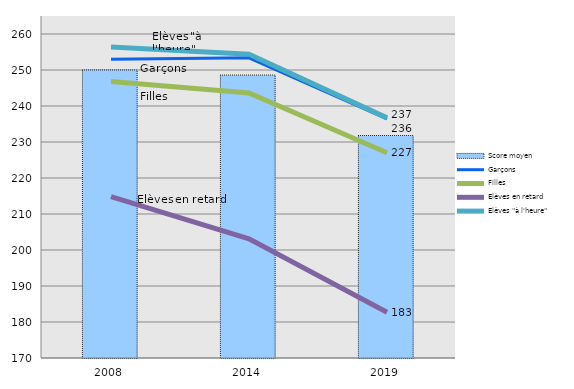
| Category | Score moyen |
|---|---|
| 2008.0 | 250 |
| 2014.0 | 248.6 |
| 2019.0 | 231.8 |